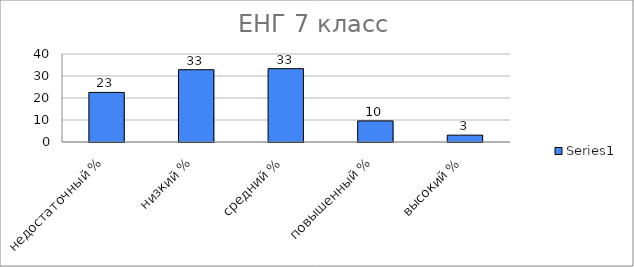
| Category | Series 0 |
|---|---|
| недостаточный % | 22.542 |
| низкий % | 32.854 |
| средний % | 33.333 |
| повышенный % | 9.592 |
| высокий % | 3.118 |